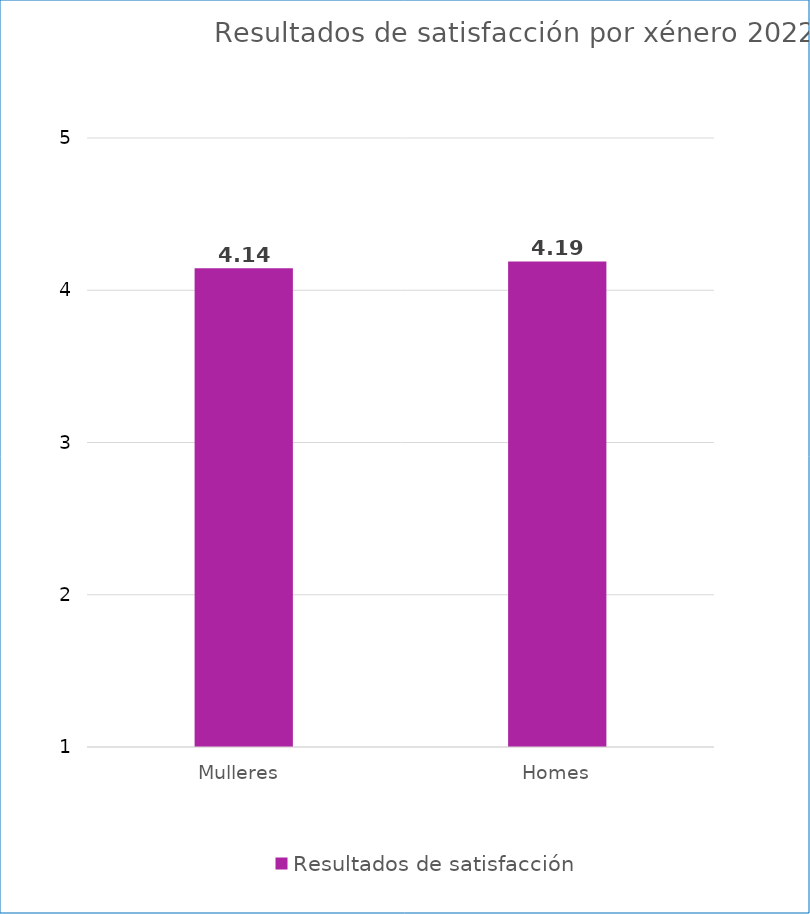
| Category | Resultados de satisfacción |
|---|---|
| Mulleres  | 4.144 |
| Homes | 4.189 |